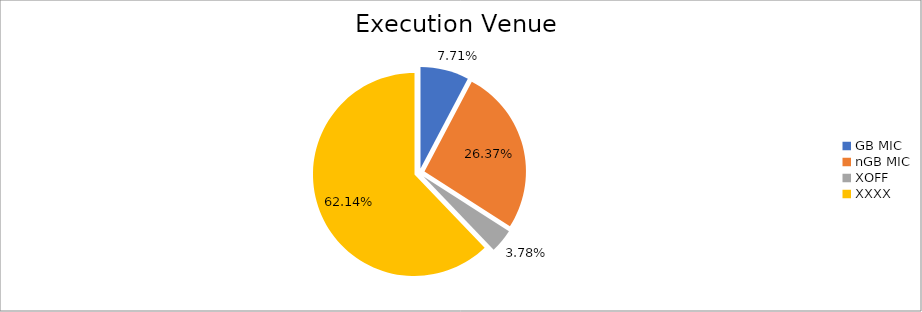
| Category | Series 0 |
|---|---|
| GB MIC | 438528.934 |
| nGB MIC | 1498660.778 |
| XOFF | 214638.88 |
| XXXX | 3532420.454 |